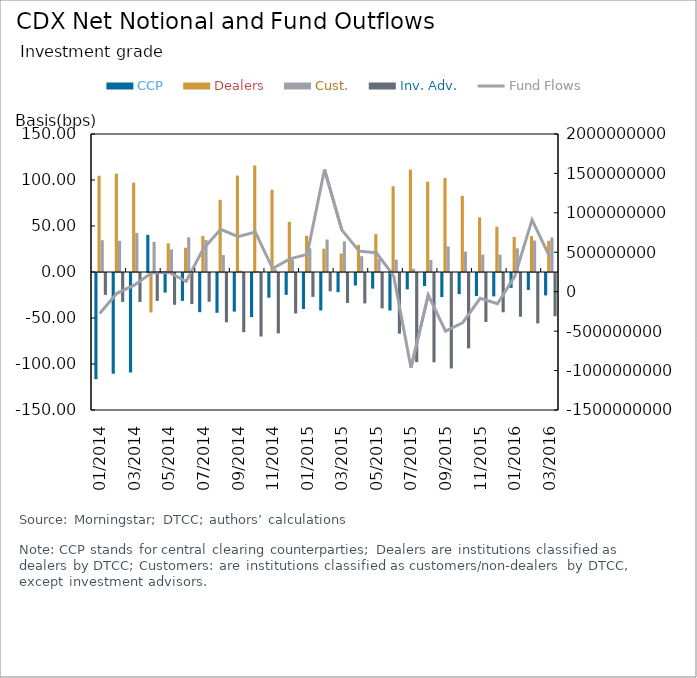
| Category | CCP | Dealers | Cust. | Inv. Adv. |
|---|---|---|---|---|
| 2014-01-01 | -115.44 | 104.639 | 34.6 | -23.799 |
| 2014-02-01 | -109.438 | 106.889 | 33.971 | -31.422 |
| 2014-03-01 | -108.147 | 97.098 | 42.51 | -31.462 |
| 2014-04-01 | 40.389 | -42.867 | 32.811 | -30.334 |
| 2014-05-01 | -21.293 | 31.202 | 24.664 | -34.573 |
| 2014-06-01 | -30.322 | 26.342 | 37.772 | -33.792 |
| 2014-07-01 | -42.587 | 39.157 | 34.693 | -31.263 |
| 2014-08-01 | -43.258 | 78.448 | 18.372 | -53.561 |
| 2014-09-01 | -41.954 | 104.802 | 1.441 | -64.288 |
| 2014-10-01 | -47.938 | 115.803 | 1.142 | -69.007 |
| 2014-11-01 | -26.827 | 89.33 | 3.176 | -65.679 |
| 2014-12-01 | -23.763 | 54.558 | 13.2 | -43.994 |
| 2015-01-01 | -39.146 | 39.376 | 25.691 | -25.921 |
| 2015-02-01 | -40.721 | 25.304 | 35.255 | -19.838 |
| 2015-03-01 | -20.846 | 20.096 | 33.302 | -32.552 |
| 2015-04-01 | -13.599 | 29.5 | 17.162 | -33.064 |
| 2015-05-01 | -16.983 | 41.099 | 14.331 | -38.448 |
| 2015-06-01 | -40.769 | 93.201 | 13.529 | -65.961 |
| 2015-07-01 | -17.78 | 111.277 | 3.435 | -96.932 |
| 2015-08-01 | -14.141 | 98.186 | 13.041 | -97.086 |
| 2015-09-01 | -26.185 | 102.166 | 27.762 | -103.743 |
| 2015-10-01 | -23.004 | 82.744 | 22.198 | -81.938 |
| 2015-11-01 | -25.016 | 59.367 | 18.841 | -53.192 |
| 2015-12-01 | -25.441 | 49.253 | 18.877 | -42.689 |
| 2016-01-01 | -16.164 | 38.036 | 25.657 | -47.53 |
| 2016-02-01 | -18.429 | 39.022 | 34.192 | -54.785 |
| 2016-03-01 | -24.35 | 33.83 | 37.531 | -47.011 |